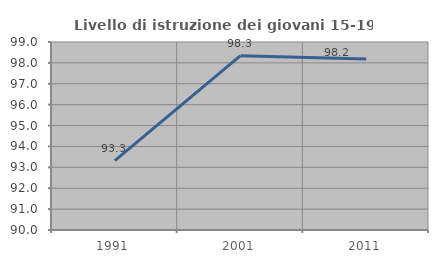
| Category | Livello di istruzione dei giovani 15-19 anni |
|---|---|
| 1991.0 | 93.325 |
| 2001.0 | 98.347 |
| 2011.0 | 98.185 |